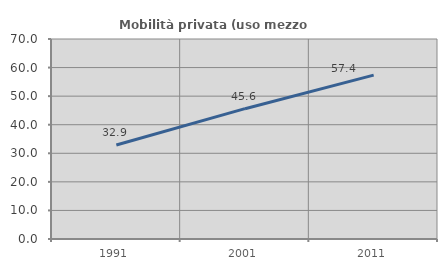
| Category | Mobilità privata (uso mezzo privato) |
|---|---|
| 1991.0 | 32.886 |
| 2001.0 | 45.614 |
| 2011.0 | 57.364 |